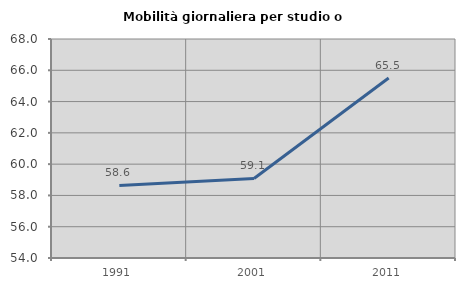
| Category | Mobilità giornaliera per studio o lavoro |
|---|---|
| 1991.0 | 58.638 |
| 2001.0 | 59.087 |
| 2011.0 | 65.509 |